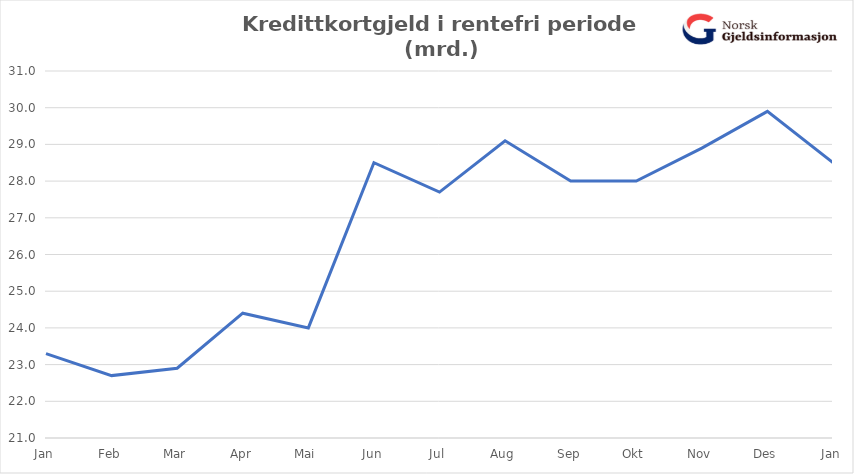
| Category | Ikke-rentebærende rammekreditt | Rentebærende rammekreditt |
|---|---|---|
| Jan | 23.3 |  |
| Feb | 22.7 |  |
| Mar | 22.9 |  |
| Apr | 24.4 |  |
| Mai | 24 |  |
| Jun | 28.5 |  |
| Jul | 27.7 |  |
| Aug | 29.1 |  |
| Sep | 28 |  |
| Okt | 28 |  |
| Nov | 28.9 |  |
| Des | 29.9 |  |
| Jan | 28.5 |  |